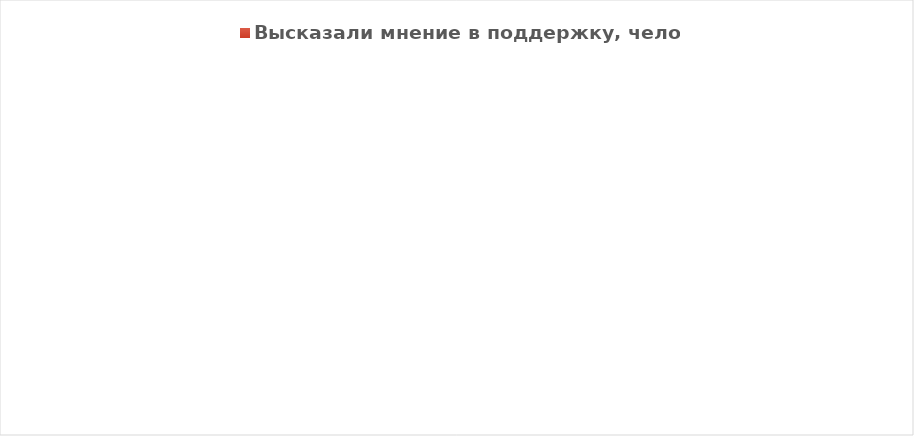
| Category | Высказали мнение в поддержку, человек |
|---|---|
| Благоустройство спортивного стадиона "Остров мечты" | 66 |
| Благоустройство парковой зоны с.Александровка "Ласточкино гнездо" | 11 |
| Блогоустройство кладбища д.Казанка "Память поколениям" | 5 |
| Ваши предложения | 0 |
| Всего опрошено, человек | 82 |